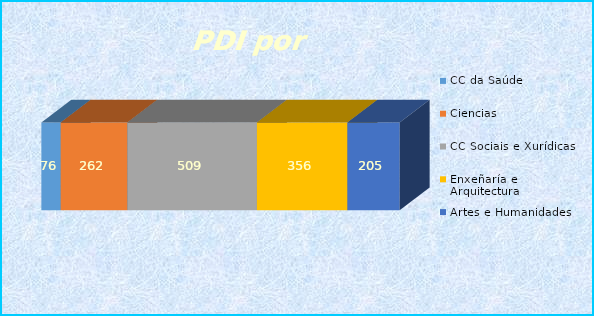
| Category | CC da Saúde | Ciencias | CC Sociais e Xurídicas | Enxeñaría e Arquitectura | Artes e Humanidades |
|---|---|---|---|---|---|
| 0 | 76 | 262 | 509 | 356 | 205 |